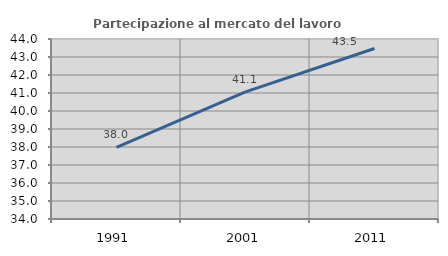
| Category | Partecipazione al mercato del lavoro  femminile |
|---|---|
| 1991.0 | 37.984 |
| 2001.0 | 41.064 |
| 2011.0 | 43.472 |